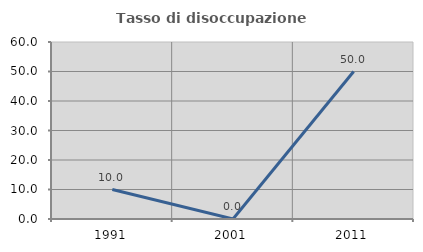
| Category | Tasso di disoccupazione giovanile  |
|---|---|
| 1991.0 | 10 |
| 2001.0 | 0 |
| 2011.0 | 50 |